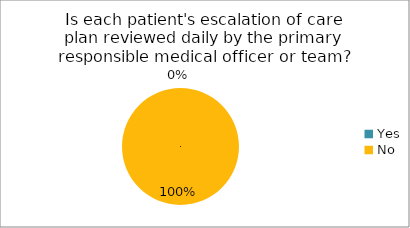
| Category | Is each patient's escalation of care plan reviewed daily by the primary responsible medical officer or team? | Is each patient's between the flags calling criteria reviewed by the primary responsible medical officer or team prior to transfer to the ward? | Is each patient's management plans documented daily by the admitting medical officer? | Is medical handover documented at transfer of care using a formalised process? | Is nursing handover documented at transfer of care using a formalised process? |
|---|---|---|---|---|---|
| Yes | 0 | 0 | 0 | 0 | 0 |
| No | 1 | 1 | 1 | 1 | 1 |